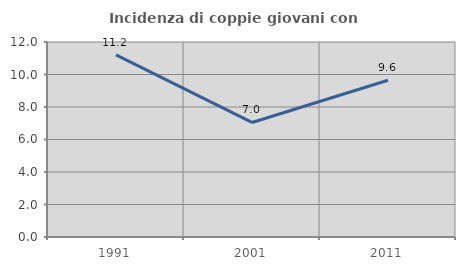
| Category | Incidenza di coppie giovani con figli |
|---|---|
| 1991.0 | 11.203 |
| 2001.0 | 7.048 |
| 2011.0 | 9.645 |